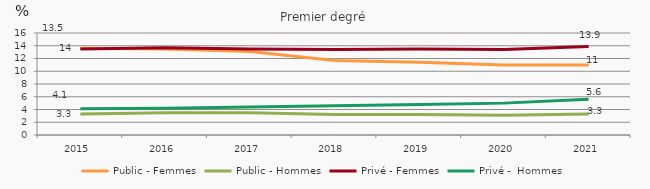
| Category | Public - Femmes | Public - Hommes | Privé - Femmes | Privé -  Hommes |
|---|---|---|---|---|
| 2015.0 | 13.6 | 3.3 | 13.5 | 4.1 |
| 2016.0 | 13.5 | 3.5 | 13.7 | 4.2 |
| 2017.0 | 13.1 | 3.5 | 13.5 | 4.4 |
| 2018.0 | 11.7 | 3.2 | 13.4 | 4.6 |
| 2019.0 | 11.4 | 3.2 | 13.5 | 4.8 |
| 2020.0 | 11 | 3.1 | 13.4 | 5 |
| 2021.0 | 11 | 3.3 | 13.9 | 5.6 |